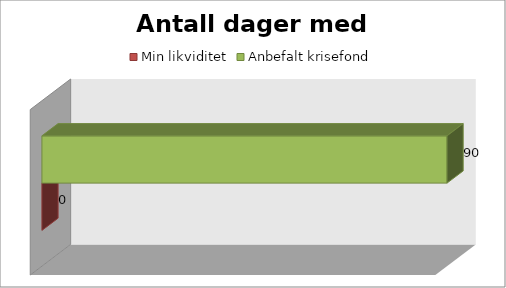
| Category | Min likviditet | Anbefalt krisefond |
|---|---|---|
| 0 | 0 | 90 |